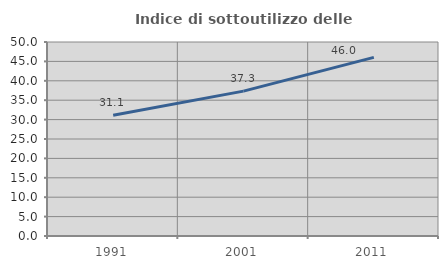
| Category | Indice di sottoutilizzo delle abitazioni  |
|---|---|
| 1991.0 | 31.126 |
| 2001.0 | 37.344 |
| 2011.0 | 46.032 |